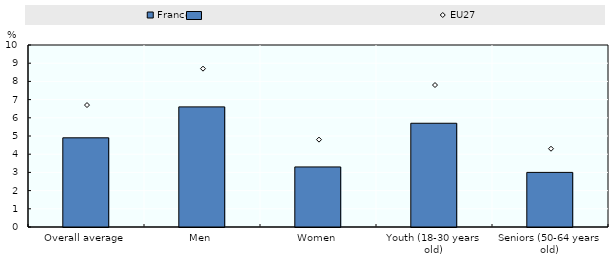
| Category | France |
|---|---|
| Overall average | 4.9 |
| Men | 6.6 |
| Women | 3.3 |
| Youth (18-30 years old) | 5.7 |
| Seniors (50-64 years old) | 3 |